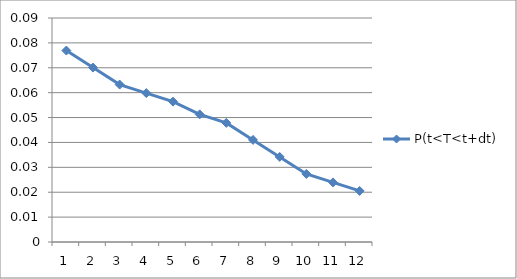
| Category | P(t<T<t+dt) |
|---|---|
| 0 | 0.077 |
| 1 | 0.07 |
| 2 | 0.063 |
| 3 | 0.06 |
| 4 | 0.056 |
| 5 | 0.051 |
| 6 | 0.048 |
| 7 | 0.041 |
| 8 | 0.034 |
| 9 | 0.027 |
| 10 | 0.024 |
| 11 | 0.021 |